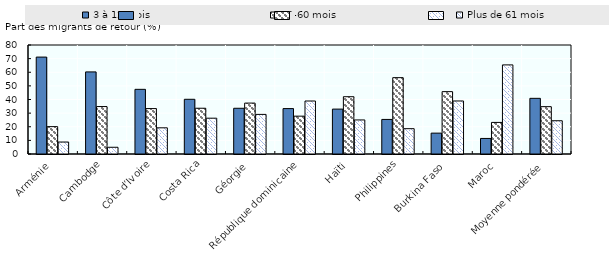
| Category | 3 à 12 mois | 13-60 mois | Plus de 61 mois |
|---|---|---|---|
| Arménie | 71.13 | 20.09 | 8.78 |
| Cambodge | 60.25 | 34.82 | 4.94 |
| Côte d’Ivoire | 47.46 | 33.33 | 19.21 |
| Costa Rica | 40.15 | 33.58 | 26.28 |
| Géorgie | 33.56 | 37.37 | 29.07 |
| République dominicaine | 33.33 | 27.77 | 38.89 |
| Haïti | 32.95 | 42.05 | 25 |
| Philippines | 25.37 | 56.04 | 18.58 |
| Burkina Faso | 15.32 | 45.76 | 38.92 |
| Maroc | 11.42 | 23.18 | 65.4 |
| Moyenne pondérée | 40.85 | 34.74 | 24.41 |